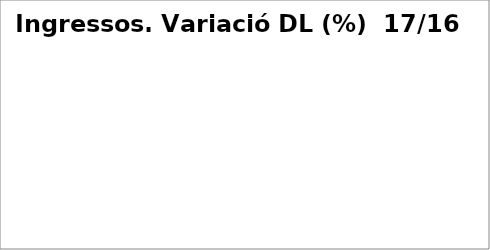
| Category | Series 0 |
|---|---|
| Impostos directes | 0.025 |
| Impostos indirectes | 0.048 |
| Taxes, preus públics i altres ingressos | -0.075 |
| Transferències corrents | 0.036 |
| Ingressos patrimonials | 0.142 |
| Venda d'inversions reals | 0.101 |
| Transferències de capital | -0.896 |
| Actius financers* | -1 |
| Passius financers | 0.281 |